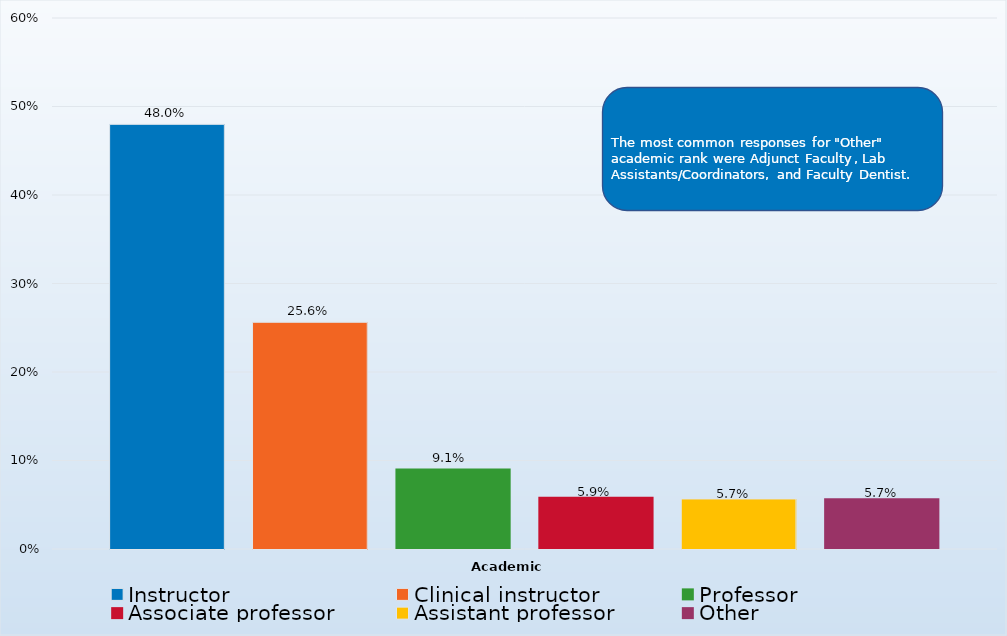
| Category | Instructor | Clinical instructor | Professor | Associate professor | Assistant professor | Other |
|---|---|---|---|---|---|---|
| 0 | 0.48 | 0.256 | 0.091 | 0.059 | 0.057 | 0.057 |